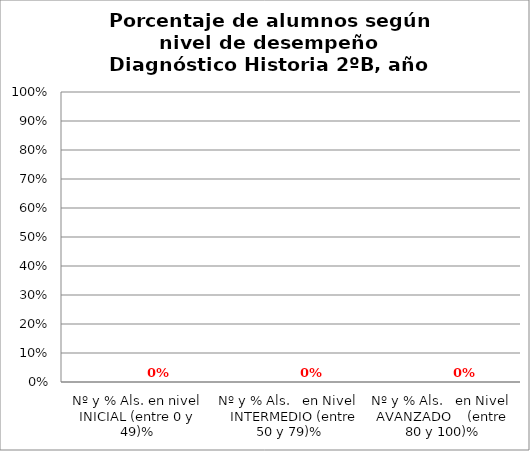
| Category | Series 0 | Series 1 | Series 2 | Series 3 |
|---|---|---|---|---|
| Nº y % Als. en nivel INICIAL (entre 0 y 49)% |  |  |  | 0 |
| Nº y % Als.   en Nivel    INTERMEDIO (entre 50 y 79)% |  |  |  | 0 |
| Nº y % Als.   en Nivel  AVANZADO    (entre 80 y 100)% |  |  |  | 0 |